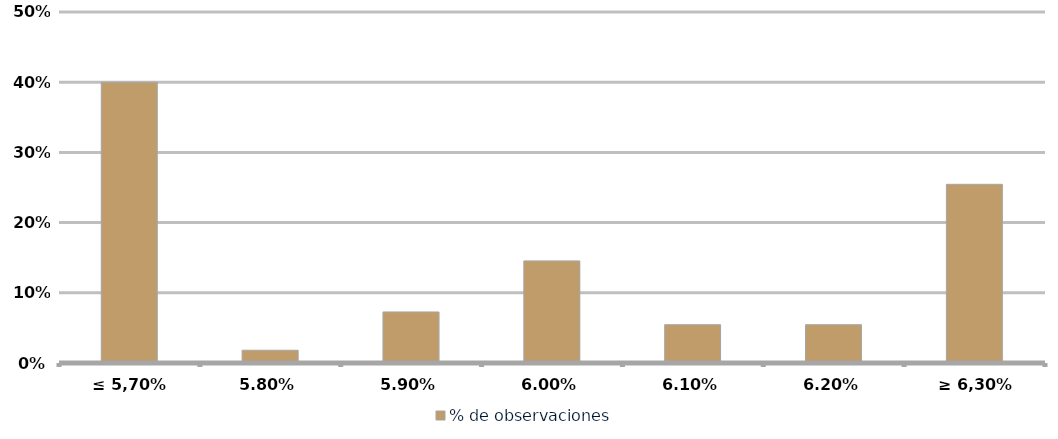
| Category | % de observaciones  |
|---|---|
| ≤ 5,70% | 0.4 |
| 5,80% | 0.018 |
| 5,90% | 0.073 |
| 6,00% | 0.145 |
| 6,10% | 0.055 |
| 6,20% | 0.055 |
| ≥ 6,30% | 0.255 |